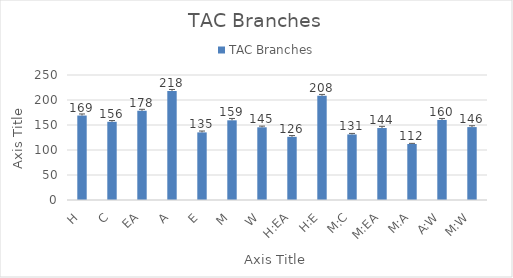
| Category | TAC Branches |
|---|---|
| H | 168.916 |
| C | 156.408 |
| EA | 178.302 |
| A | 218.155 |
| E | 135.221 |
| M | 159.375 |
| W | 145.389 |
| H:EA | 126.315 |
| H:E | 208.436 |
| M:C | 131.103 |
| M:EA | 143.939 |
| M:A | 112.027 |
| A:W | 160.156 |
| M:W | 145.833 |